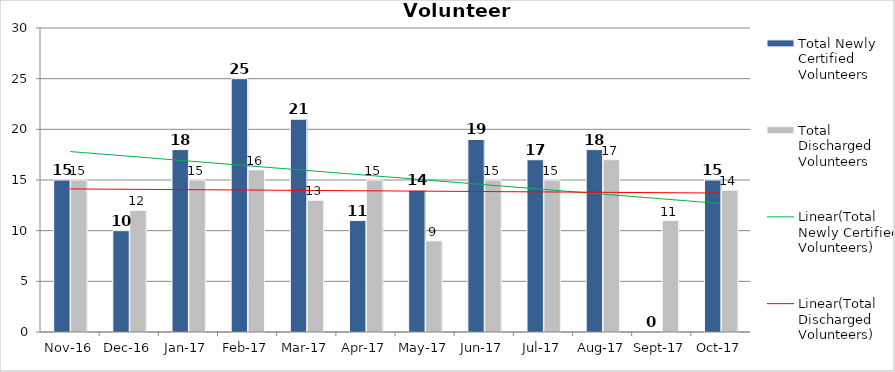
| Category | Total Newly Certified Volunteers | Total Discharged Volunteers |
|---|---|---|
| 2016-11-01 | 15 | 15 |
| 2016-12-01 | 10 | 12 |
| 2017-01-01 | 18 | 15 |
| 2017-02-01 | 25 | 16 |
| 2017-03-01 | 21 | 13 |
| 2017-04-01 | 11 | 15 |
| 2017-05-01 | 14 | 9 |
| 2017-06-01 | 19 | 15 |
| 2017-07-01 | 17 | 15 |
| 2017-08-01 | 18 | 17 |
| 2017-09-01 | 0 | 11 |
| 2017-10-01 | 15 | 14 |